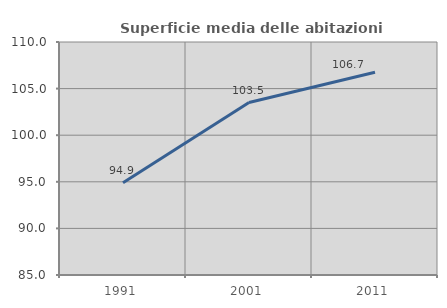
| Category | Superficie media delle abitazioni occupate |
|---|---|
| 1991.0 | 94.889 |
| 2001.0 | 103.505 |
| 2011.0 | 106.749 |